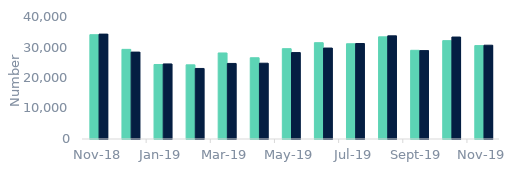
| Category | First-time
buyers | Home movers |
|---|---|---|
| 2018-11-01 | 34200 | 34390 |
| 2018-12-01 | 29390 | 28490 |
| 2019-01-01 | 24430 | 24610 |
| 2019-02-01 | 24320 | 23130 |
| 2019-03-01 | 28210 | 24770 |
| 2019-04-01 | 26640 | 24850 |
| 2019-05-01 | 29620 | 28340 |
| 2019-06-01 | 31580 | 29820 |
| 2019-07-01 | 31230 | 31310 |
| 2019-08-01 | 33490 | 33820 |
| 2019-09-01 | 29080 | 28980 |
| 2019-10-01 | 32250 | 33430 |
| 2019-11-01 | 30620 | 30750 |